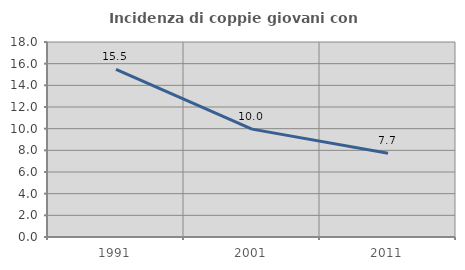
| Category | Incidenza di coppie giovani con figli |
|---|---|
| 1991.0 | 15.464 |
| 2001.0 | 9.957 |
| 2011.0 | 7.725 |